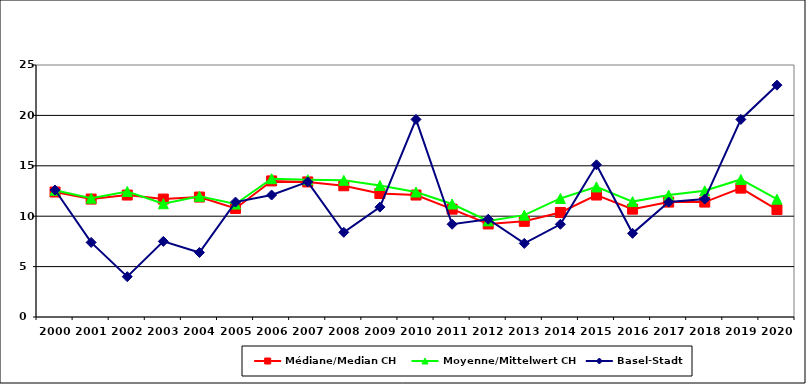
| Category | Médiane/Median CH | Moyenne/Mittelwert CH | Basel-Stadt |
|---|---|---|---|
| 2000.0 | 12.4 | 12.575 | 12.6 |
| 2001.0 | 11.7 | 11.788 | 7.4 |
| 2002.0 | 12.1 | 12.452 | 4 |
| 2003.0 | 11.7 | 11.236 | 7.5 |
| 2004.0 | 11.9 | 11.971 | 6.4 |
| 2005.0 | 10.768 | 11.206 | 11.4 |
| 2006.0 | 13.5 | 13.724 | 12.1 |
| 2007.0 | 13.4 | 13.616 | 13.4 |
| 2008.0 | 13.02 | 13.561 | 8.4 |
| 2009.0 | 12.25 | 13.048 | 10.9 |
| 2010.0 | 12.1 | 12.4 | 19.6 |
| 2011.0 | 10.7 | 11.209 | 9.2 |
| 2012.0 | 9.23 | 9.534 | 9.7 |
| 2013.0 | 9.49 | 10.106 | 7.3 |
| 2014.0 | 10.37 | 11.762 | 9.2 |
| 2015.0 | 12.1 | 12.906 | 15.1 |
| 2016.0 | 10.7 | 11.448 | 8.3 |
| 2017.0 | 11.4 | 12.093 | 11.4 |
| 2018.0 | 11.4 | 12.522 | 11.7 |
| 2019.0 | 12.784 | 13.645 | 19.6 |
| 2020.0 | 10.66 | 11.688 | 23 |